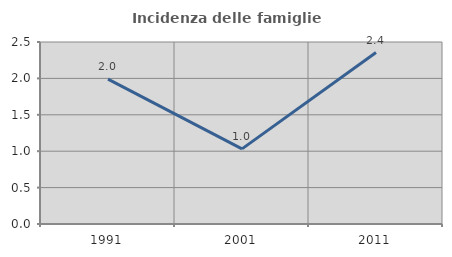
| Category | Incidenza delle famiglie numerose |
|---|---|
| 1991.0 | 1.989 |
| 2001.0 | 1.032 |
| 2011.0 | 2.355 |